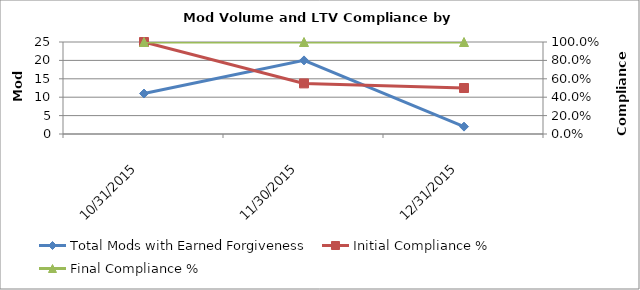
| Category | Total Mods with Earned Forgiveness |
|---|---|
| 10/31/15 | 11 |
| 11/30/15 | 20 |
| 12/31/15 | 2 |